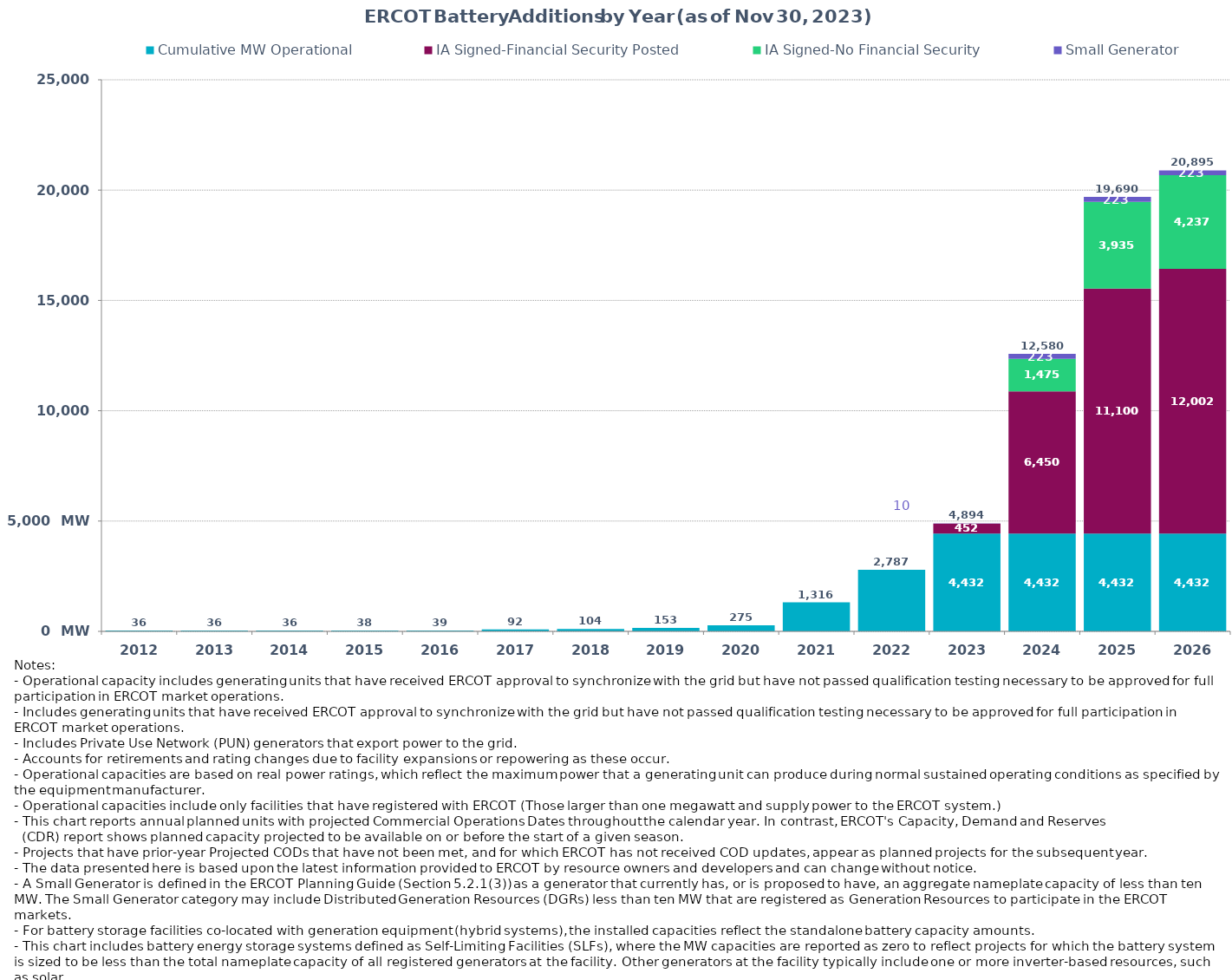
| Category | Cumulative MW Operational | IA Signed-Financial Security Posted  | IA Signed-No Financial Security  | Small Generator | Cumulative Installed and Planned |
|---|---|---|---|---|---|
| 2012.0 | 36 | 0 | 0 | 0 | 36 |
| 2013.0 | 36 | 0 | 0 | 0 | 36 |
| 2014.0 | 36 | 0 | 0 | 0 | 36 |
| 2015.0 | 38 | 0 | 0 | 0 | 38 |
| 2016.0 | 39 | 0 | 0 | 0 | 39 |
| 2017.0 | 92.3 | 0 | 0 | 0 | 92.3 |
| 2018.0 | 103.7 | 0 | 0 | 0 | 103.7 |
| 2019.0 | 153.3 | 0 | 0 | 0 | 153.3 |
| 2020.0 | 275.4 | 0 | 0 | 0 | 275.4 |
| 2021.0 | 1316.43 | 0 | 0 | 0 | 1316.43 |
| 2022.0 | 2786.86 | 0 | 0 | 0 | 2786.86 |
| 2023.0 | 4432.22 | 451.9 | 0 | 9.95 | 4894.07 |
| 2024.0 | 4432.22 | 6449.78 | 1474.63 | 223.2 | 12579.83 |
| 2025.0 | 4432.22 | 11099.84 | 3934.9 | 223.2 | 19690.16 |
| 2026.0 | 4432.22 | 12002.34 | 4237.11 | 223.2 | 20894.87 |